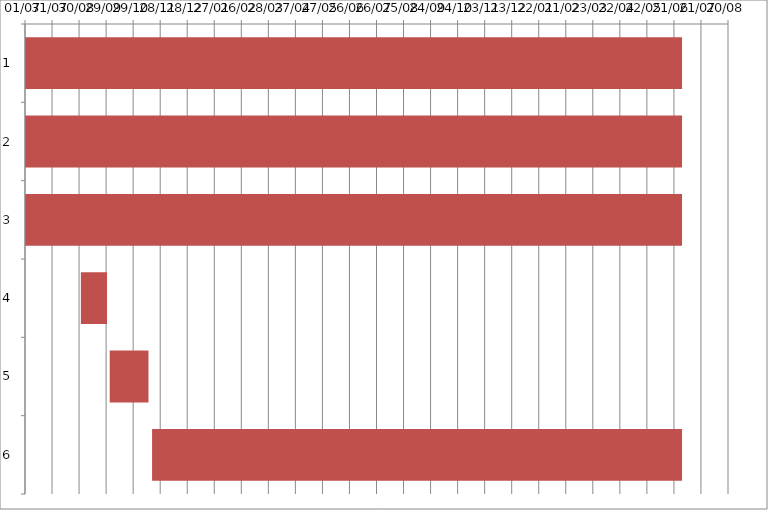
| Category | Fecha de inicio | DURACIÓN |
|---|---|---|
| 0 | 7/1/16 | 729 |
| 1 | 7/1/16 | 729 |
| 2 | 7/1/16 | 729 |
| 3 | 9/1/16 | 29 |
| 4 | 10/3/16 | 43 |
| 5 | 11/19/16 | 588 |